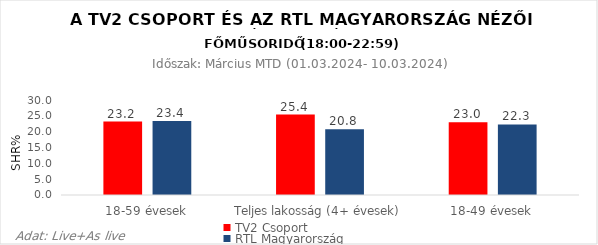
| Category | TV2 Csoport | RTL Magyarország |
|---|---|---|
| 18-59 évesek | 23.2 | 23.4 |
| Teljes lakosság (4+ évesek) | 25.4 | 20.8 |
| 18-49 évesek | 23 | 22.3 |